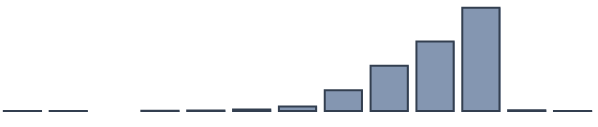
| Category | Series 0 |
|---|---|
| 0 | 0.043 |
| 1 | 0.043 |
| 2 | 0 |
| 3 | 0.087 |
| 4 | 0.217 |
| 5 | 0.609 |
| 6 | 1.826 |
| 7 | 8.435 |
| 8 | 18.348 |
| 9 | 28.174 |
| 10 | 41.826 |
| 11 | 0.348 |
| 12 | 0.043 |